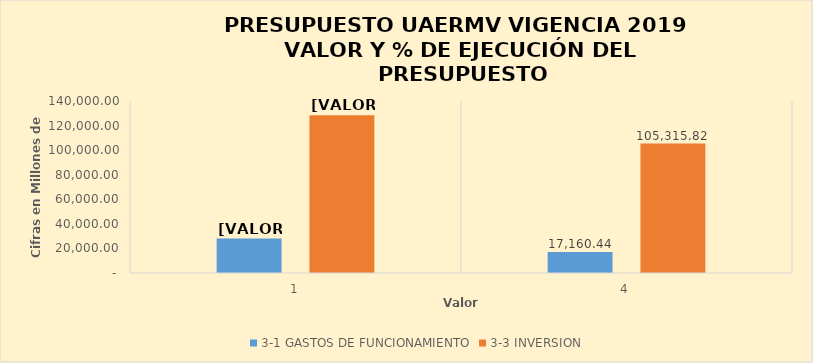
| Category | 3-1 | 3-3 |
|---|---|---|
| 0 | 28003.61 | 128393.394 |
| 1 | 17160.444 | 105315.824 |